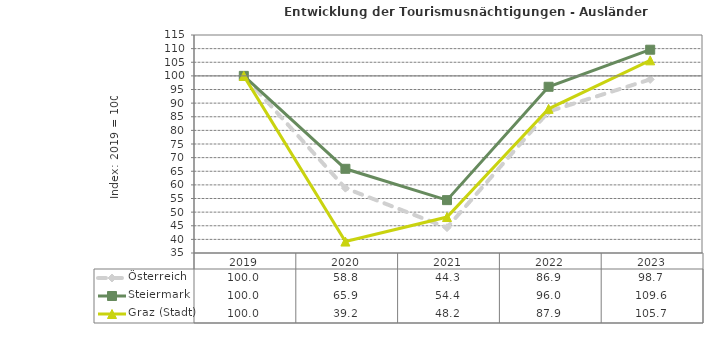
| Category | Österreich | Steiermark | Graz (Stadt) |
|---|---|---|---|
| 2023.0 | 98.7 | 109.6 | 105.7 |
| 2022.0 | 86.9 | 96 | 87.9 |
| 2021.0 | 44.3 | 54.4 | 48.2 |
| 2020.0 | 58.8 | 65.9 | 39.2 |
| 2019.0 | 100 | 100 | 100 |